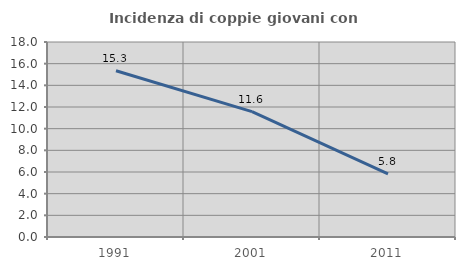
| Category | Incidenza di coppie giovani con figli |
|---|---|
| 1991.0 | 15.344 |
| 2001.0 | 11.568 |
| 2011.0 | 5.828 |